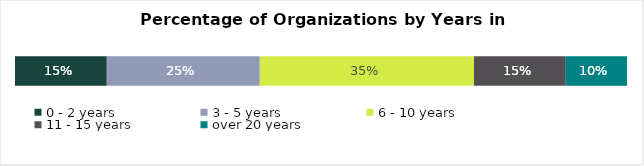
| Category | 0 - 2 years | 3 - 5 years | 6 - 10 years | 11 - 15 years | over 20 years |
|---|---|---|---|---|---|
| Total | 0.15 | 0.25 | 0.35 | 0.15 | 0.1 |